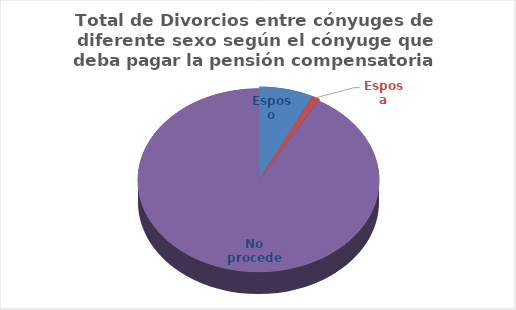
| Category | Series 0 |
|---|---|
| Esposo | 6170 |
| Esposa | 892 |
| No procede | 78118 |